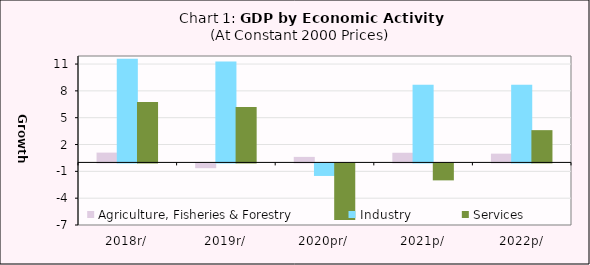
| Category | Agriculture, Fisheries & Forestry  | Industry | Services |
|---|---|---|---|
| 2018r/ | 1.098 | 11.605 | 6.76 |
| 2019r/ | -0.532 | 11.283 | 6.185 |
| 2020pr/ | 0.619 | -1.402 | -6.343 |
| 2021p/ | 1.079 | 8.673 | -1.897 |
| 2022p/ | 0.979 | 8.697 | 3.608 |